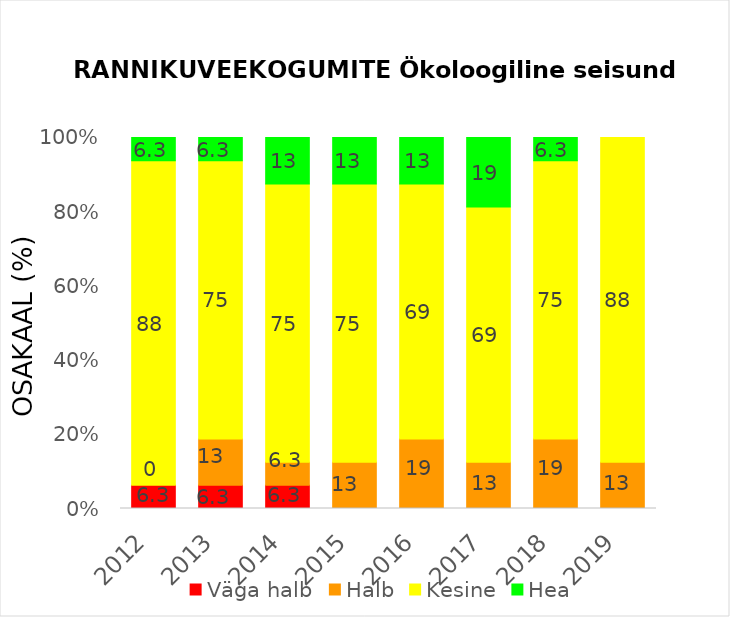
| Category | Väga halb | Halb | Kesine | Hea |
|---|---|---|---|---|
| 2012.0 | 6.25 | 0 | 87.5 | 6.25 |
| 2013.0 | 6.25 | 12.5 | 75 | 6.25 |
| 2014.0 | 6.25 | 6.25 | 75 | 12.5 |
| 2015.0 | 0 | 12.5 | 75 | 12.5 |
| 2016.0 | 0 | 18.75 | 68.75 | 12.5 |
| 2017.0 | 0 | 12.5 | 68.75 | 18.75 |
| 2018.0 | 0 | 18.75 | 75 | 6.25 |
| 2019.0 | 0 | 12.5 | 87.5 | 0 |